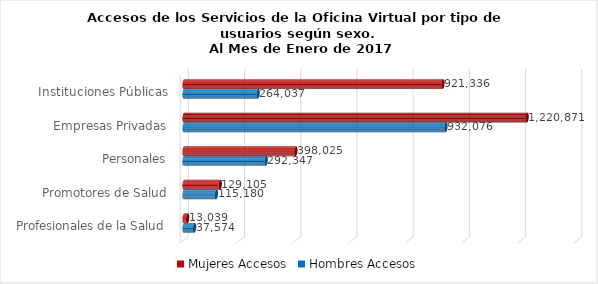
| Category | Mujeres | Hombres |
|---|---|---|
| Instituciones Públicas | 921336 | 264037 |
| Empresas Privadas | 1220871 | 932076 |
| Personales | 398025 | 292347 |
| Promotores de Salud | 129105 | 115180 |
| Profesionales de la Salud | 13039 | 37574 |